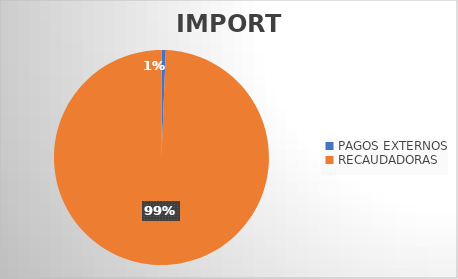
| Category | IMPORTE |
|---|---|
| PAGOS EXTERNOS | 1315278.16 |
| RECAUDADORAS | 204829952.79 |